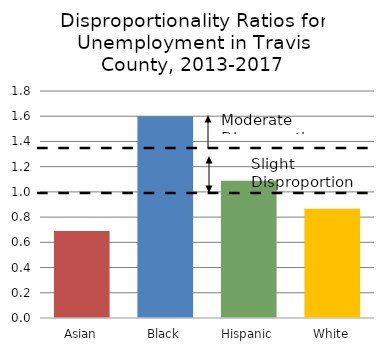
| Category | Series 0 |
|---|---|
| Asian | 0.689 |
| Black | 1.6 |
| Hispanic | 1.089 |
| White | 0.867 |